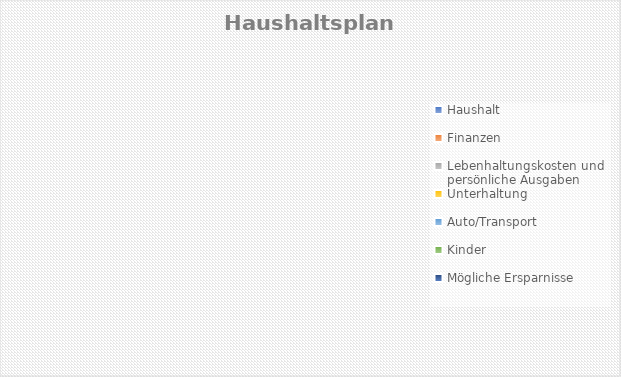
| Category | Series 0 |
|---|---|
| Haushalt | 0 |
| Finanzen | 0 |
| Lebenhaltungskosten und persönliche Ausgaben | 0 |
| Unterhaltung | 0 |
| Auto/Transport | 0 |
| Kinder | 0 |
| Mögliche Ersparnisse | 0 |